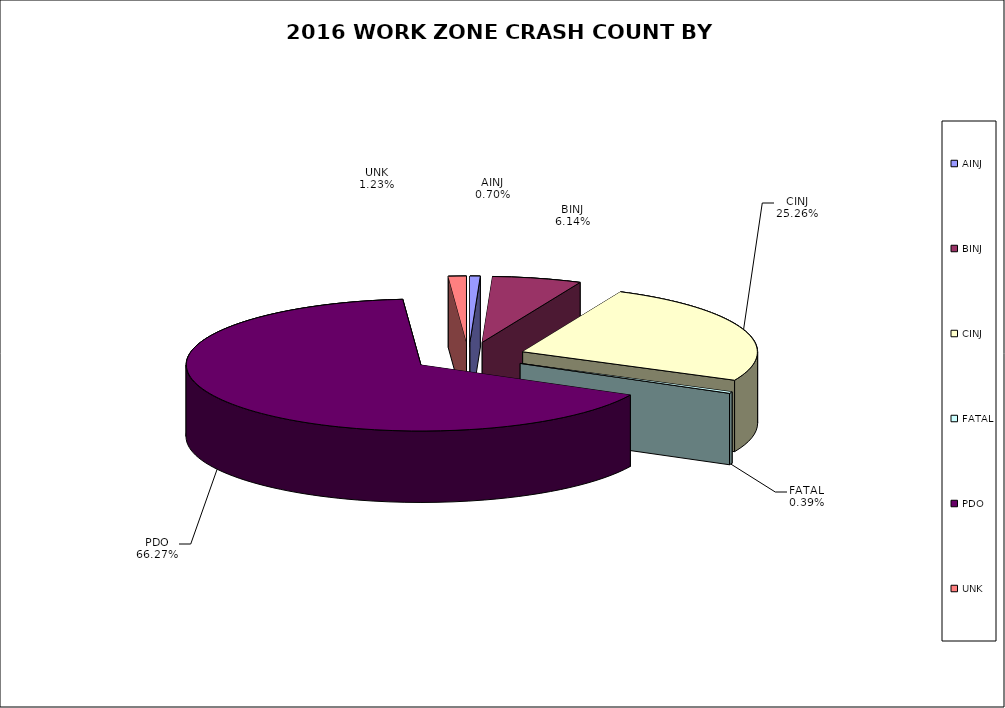
| Category | Series 0 | Series 1 |
|---|---|---|
| AINJ | 41 | 0.007 |
| BINJ | 358 | 0.061 |
| CINJ | 1473 | 0.253 |
| FATAL | 23 | 0.004 |
| PDO | 3864 | 0.663 |
| UNK | 72 | 0.012 |